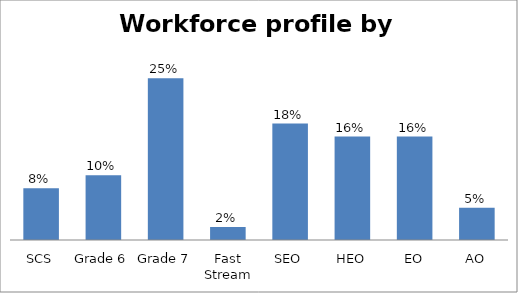
| Category | Series 0 |
|---|---|
| SCS | 0.08 |
| Grade 6 | 0.1 |
| Grade 7 | 0.25 |
| Fast Stream | 0.02 |
| SEO | 0.18 |
| HEO | 0.16 |
| EO | 0.16 |
| AO | 0.05 |